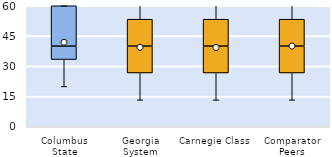
| Category | 25th | 50th | 75th |
|---|---|---|---|
| Columbus State | 33.333 | 6.667 | 20 |
| Georgia System | 26.667 | 13.333 | 13.333 |
| Carnegie Class | 26.667 | 13.333 | 13.333 |
| Comparator Peers | 26.667 | 13.333 | 13.333 |